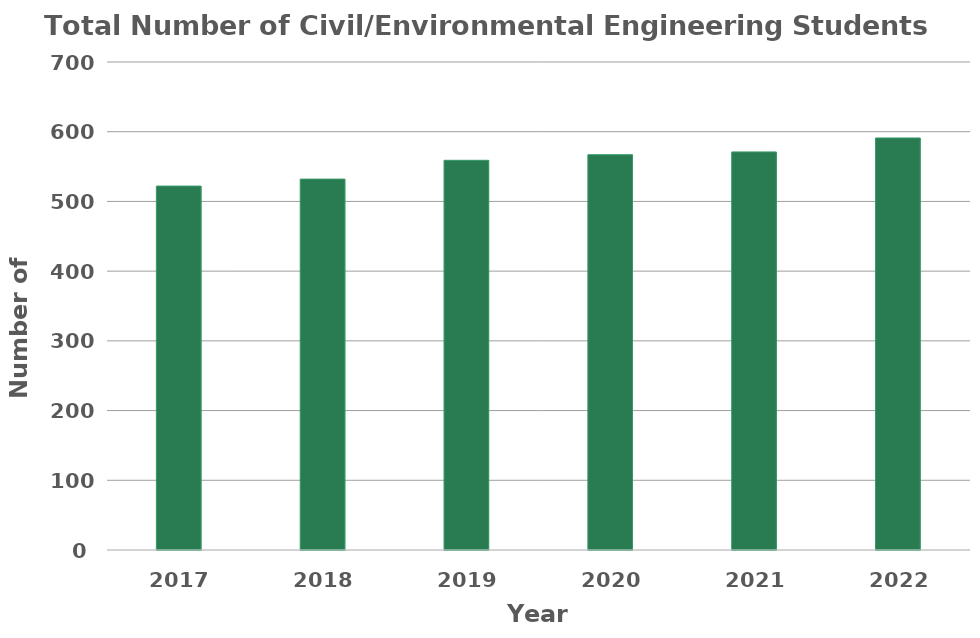
| Category | Total Number of Mechanical Engineering Students |
|---|---|
| 2017.0 | 522 |
| 2018.0 | 532 |
| 2019.0 | 559 |
| 2020.0 | 567 |
| 2021.0 | 571 |
| 2022.0 | 591 |